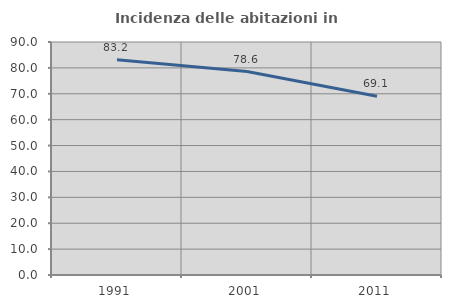
| Category | Incidenza delle abitazioni in proprietà  |
|---|---|
| 1991.0 | 83.184 |
| 2001.0 | 78.577 |
| 2011.0 | 69.058 |